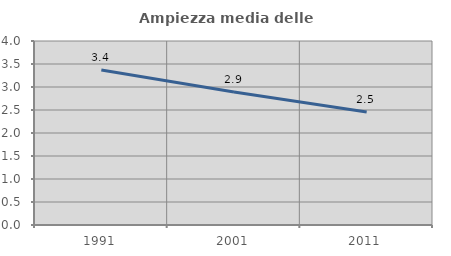
| Category | Ampiezza media delle famiglie |
|---|---|
| 1991.0 | 3.368 |
| 2001.0 | 2.892 |
| 2011.0 | 2.455 |